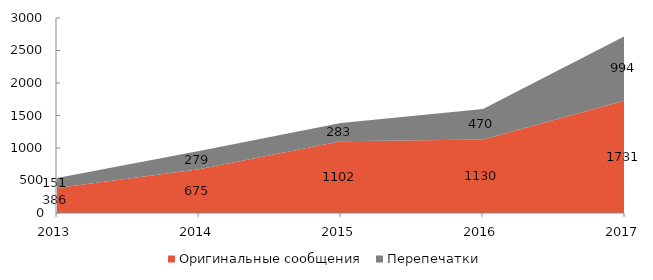
| Category | Оригинальные сообщения | Перепечатки |
|---|---|---|
| 2013 | 386 | 151 |
| 2014 | 675 | 279 |
| 2015 | 1102 | 283 |
| 2016 | 1130 | 470 |
| 2017 | 1731 | 994 |